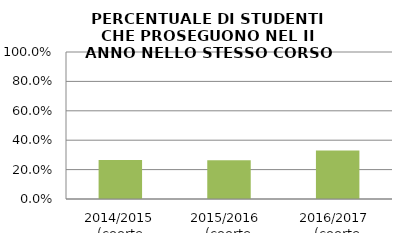
| Category | 2014/2015 (coorte 2013/14) 2015/2016  (coorte 2014/15) 2016/2017  (coorte 2015/16) |
|---|---|
| 2014/2015 (coorte 2013/14) | 0.265 |
| 2015/2016  (coorte 2014/15) | 0.264 |
| 2016/2017  (coorte 2015/16) | 0.329 |